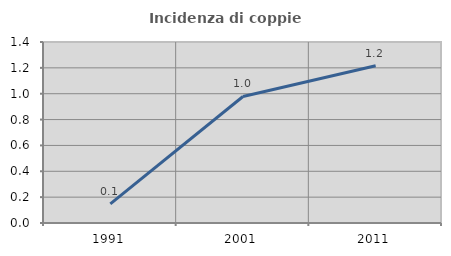
| Category | Incidenza di coppie miste |
|---|---|
| 1991.0 | 0.148 |
| 2001.0 | 0.979 |
| 2011.0 | 1.216 |